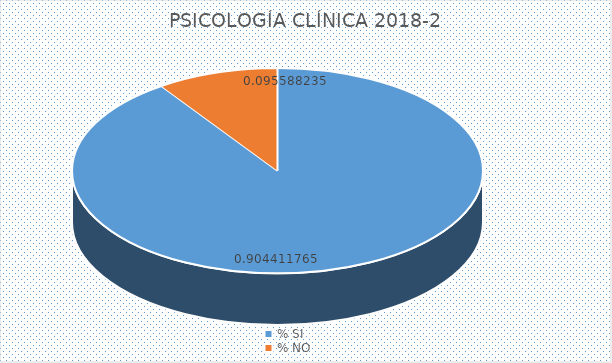
| Category | Series 0 |
|---|---|
| % SI | 0.904 |
| % NO | 0.096 |